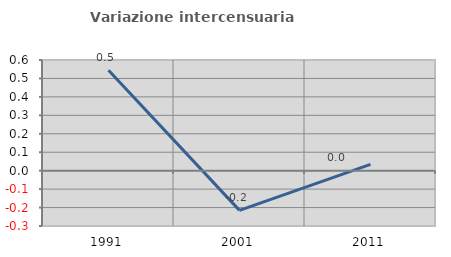
| Category | Variazione intercensuaria annua |
|---|---|
| 1991.0 | 0.545 |
| 2001.0 | -0.215 |
| 2011.0 | 0.034 |